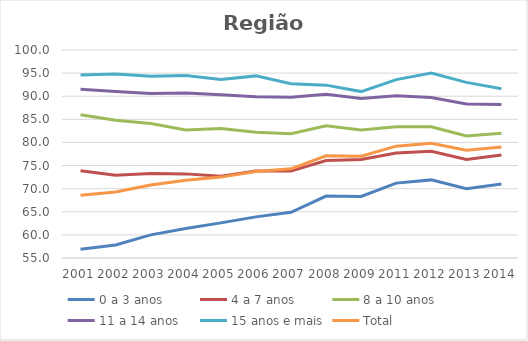
| Category | 0 a 3 anos | 4 a 7 anos | 8 a 10 anos | 11 a 14 anos | 15 anos e mais | Total |
|---|---|---|---|---|---|---|
| 2001.0 | 56.9 | 73.9 | 86 | 91.5 | 94.6 | 68.6 |
| 2002.0 | 57.8 | 72.9 | 84.8 | 91 | 94.8 | 69.3 |
| 2003.0 | 60 | 73.3 | 84.1 | 90.6 | 94.3 | 70.8 |
| 2004.0 | 61.4 | 73.2 | 82.7 | 90.7 | 94.5 | 71.8 |
| 2005.0 | 62.6 | 72.7 | 83 | 90.3 | 93.6 | 72.5 |
| 2006.0 | 63.9 | 73.8 | 82.2 | 89.9 | 94.4 | 73.7 |
| 2007.0 | 64.9 | 73.8 | 81.9 | 89.8 | 92.7 | 74.3 |
| 2008.0 | 68.4 | 76.1 | 83.6 | 90.4 | 92.4 | 77.1 |
| 2009.0 | 68.3 | 76.3 | 82.7 | 89.5 | 91 | 77 |
| 2011.0 | 71.2 | 77.7 | 83.4 | 90.1 | 93.6 | 79.2 |
| 2012.0 | 71.9 | 78.1 | 83.4 | 89.7 | 95 | 79.8 |
| 2013.0 | 70 | 76.3 | 81.4 | 88.3 | 93 | 78.3 |
| 2014.0 | 71 | 77.3 | 82 | 88.2 | 91.6 | 79 |